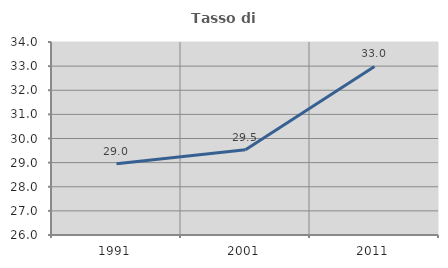
| Category | Tasso di occupazione   |
|---|---|
| 1991.0 | 28.954 |
| 2001.0 | 29.538 |
| 2011.0 | 32.985 |